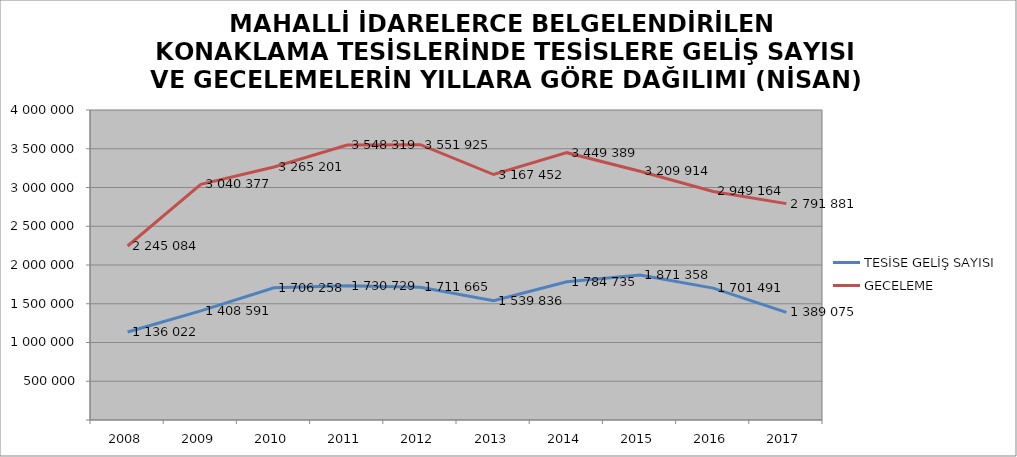
| Category | TESİSE GELİŞ SAYISI | GECELEME |
|---|---|---|
| 2008 | 1136022 | 2245084 |
| 2009 | 1408591 | 3040377 |
| 2010 | 1706258 | 3265201 |
| 2011 | 1730729 | 3548319 |
| 2012 | 1711665 | 3551925 |
| 2013 | 1539836 | 3167452 |
| 2014 | 1784735 | 3449389 |
| 2015 | 1871358 | 3209914 |
| 2016 | 1701491 | 2949164 |
| 2017 | 1389075 | 2791881 |